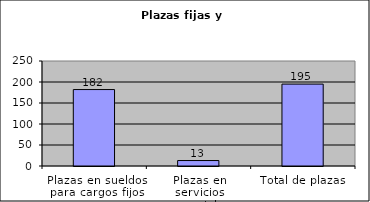
| Category | Series 0 |
|---|---|
| Plazas en sueldos para cargos fijos | 182 |
| Plazas en servicios especiales | 13 |
| Total de plazas | 195 |